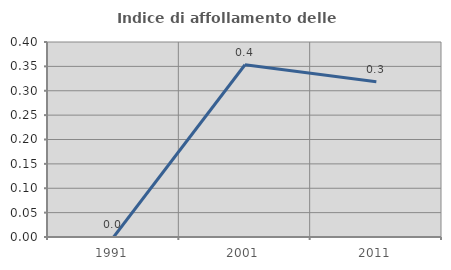
| Category | Indice di affollamento delle abitazioni  |
|---|---|
| 1991.0 | 0 |
| 2001.0 | 0.353 |
| 2011.0 | 0.318 |